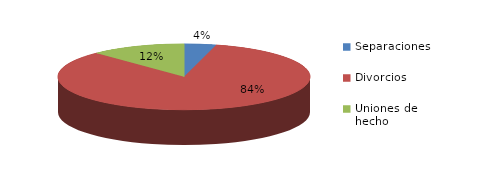
| Category | Series 0 |
|---|---|
| Separaciones | 32 |
| Divorcios | 654 |
| Uniones de hecho | 95 |